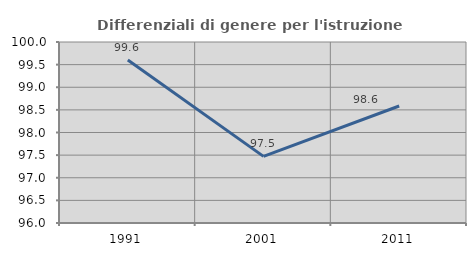
| Category | Differenziali di genere per l'istruzione superiore |
|---|---|
| 1991.0 | 99.604 |
| 2001.0 | 97.473 |
| 2011.0 | 98.585 |